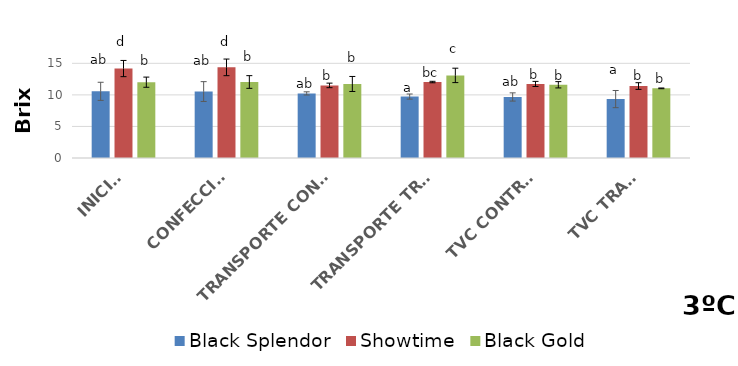
| Category | Black Splendor | Showtime | Black Gold |
|---|---|---|---|
| INICIAL | 10.563 | 14.17 | 12.01 |
| CONFECCIÓN | 10.527 | 14.358 | 12.042 |
|  TRANSPORTE CONTROL | 10.233 | 11.5 | 11.728 |
| TRANSPORTE TRAT. | 9.733 | 12.033 | 13.086 |
| TVC CONTROL | 9.667 | 11.733 | 11.6 |
| TVC TRAT. | 9.333 | 11.4 | 11.033 |